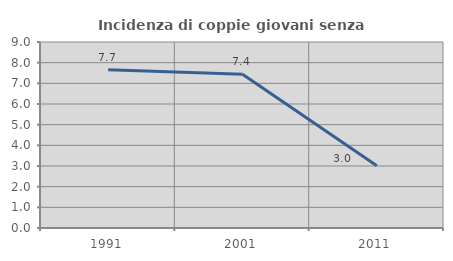
| Category | Incidenza di coppie giovani senza figli |
|---|---|
| 1991.0 | 7.653 |
| 2001.0 | 7.443 |
| 2011.0 | 3.015 |